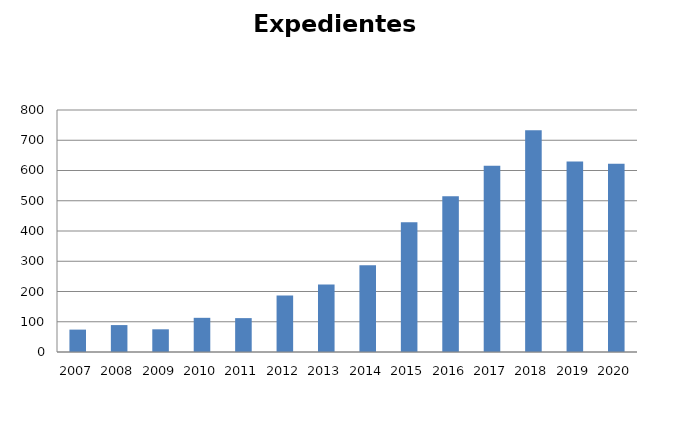
| Category | Expedientes Gubernativos |
|---|---|
| 2007.0 | 74 |
| 2008.0 | 89 |
| 2009.0 | 75 |
| 2010.0 | 113 |
| 2011.0 | 112 |
| 2012.0 | 187 |
| 2013.0 | 223 |
| 2014.0 | 287 |
| 2015.0 | 429 |
| 2016.0 | 515 |
| 2017.0 | 616 |
| 2018.0 | 733 |
| 2019.0 | 630 |
| 2020.0 | 622 |